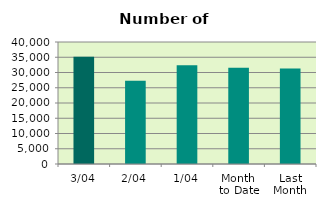
| Category | Series 0 |
|---|---|
| 3/04 | 35134 |
| 2/04 | 27294 |
| 1/04 | 32352 |
| Month 
to Date | 31593.333 |
| Last
Month | 31344.095 |